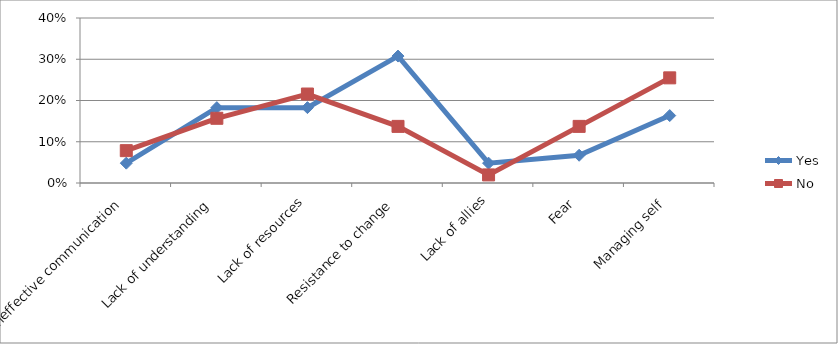
| Category | Yes | No |
|---|---|---|
| Ineffective communication | 0.048 | 0.078 |
| Lack of understanding | 0.183 | 0.157 |
| Lack of resources | 0.183 | 0.216 |
| Resistance to change | 0.308 | 0.137 |
| Lack of allies | 0.048 | 0.02 |
| Fear | 0.067 | 0.137 |
| Managing self | 0.163 | 0.255 |